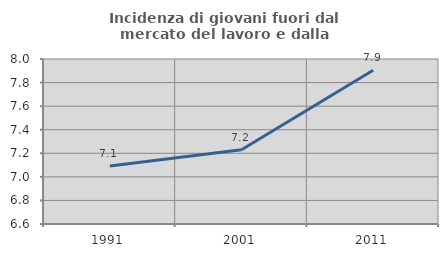
| Category | Incidenza di giovani fuori dal mercato del lavoro e dalla formazione  |
|---|---|
| 1991.0 | 7.092 |
| 2001.0 | 7.23 |
| 2011.0 | 7.905 |